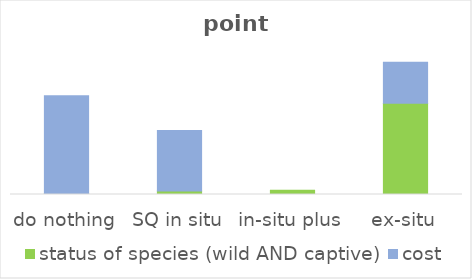
| Category | status of species (wild AND captive) | cost |
|---|---|---|
| do nothing | 0.004 | 0.394 |
| SQ in situ | 0.014 | 0.243 |
| in-situ plus | 0.017 | 0 |
| ex-situ | 0.367 | 0.165 |